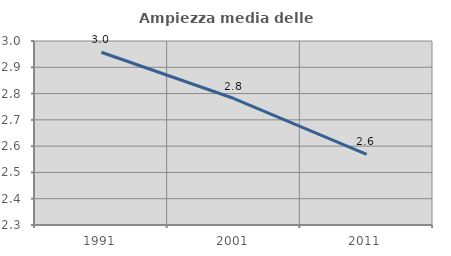
| Category | Ampiezza media delle famiglie |
|---|---|
| 1991.0 | 2.957 |
| 2001.0 | 2.781 |
| 2011.0 | 2.568 |